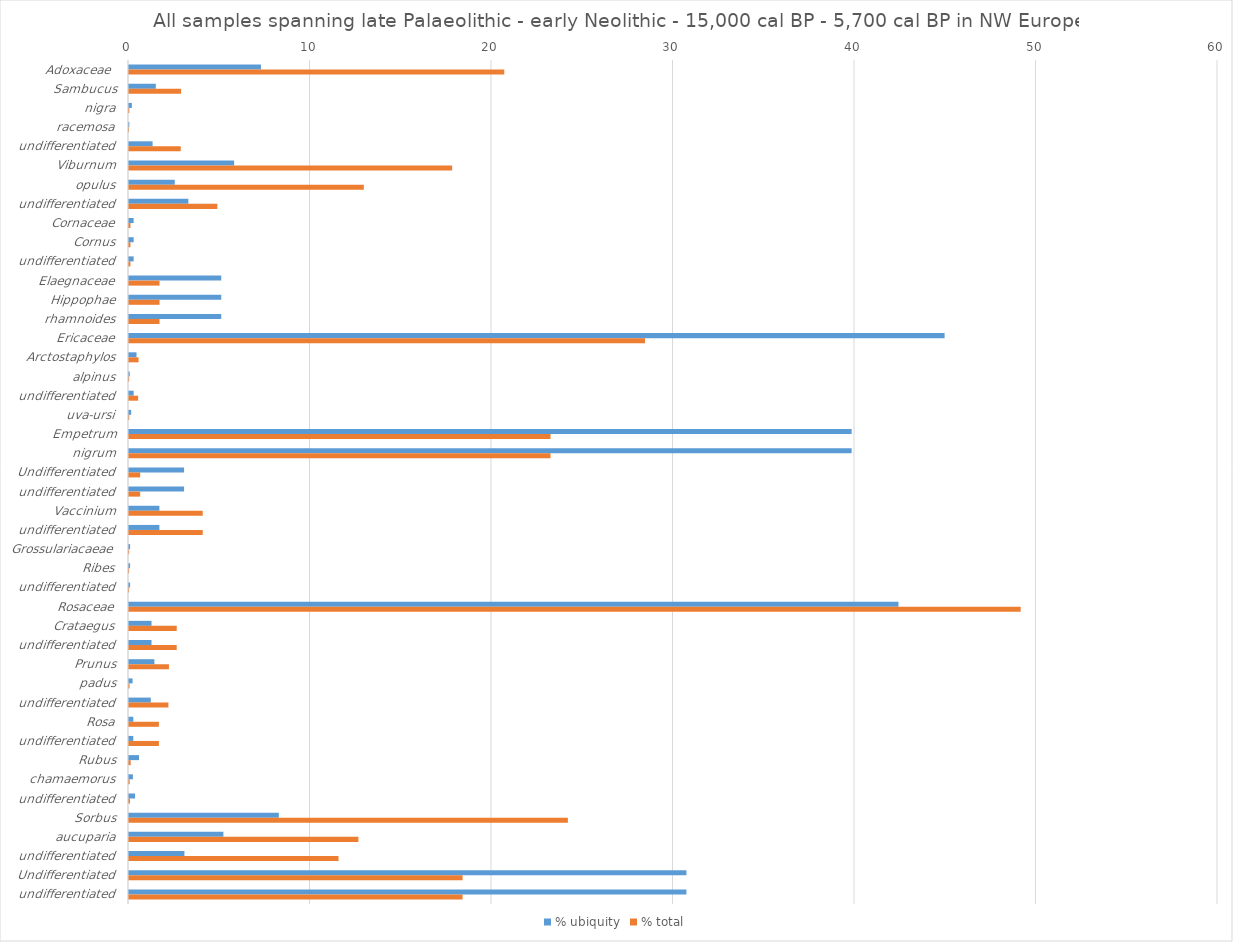
| Category | % ubiquity | % total |
|---|---|---|
| Adoxaceae  | 7.27 | 20.674 |
| Sambucus | 1.478 | 2.87 |
| nigra | 0.158 | 0.018 |
| racemosa | 0.02 | 0 |
| undifferentiated | 1.3 | 2.851 |
| Viburnum | 5.792 | 17.804 |
| opulus | 2.522 | 12.938 |
| undifferentiated | 3.27 | 4.866 |
| Cornaceae | 0.256 | 0.079 |
| Cornus | 0.256 | 0.079 |
| undifferentiated | 0.256 | 0.079 |
| Elaegnaceae | 5.083 | 1.683 |
| Hippophae | 5.083 | 1.683 |
| rhamnoides | 5.083 | 1.683 |
| Ericaceae | 44.937 | 28.431 |
| Arctostaphylos | 0.414 | 0.526 |
| alpinus | 0.039 | 0.009 |
| undifferentiated | 0.256 | 0.503 |
| uva-ursi | 0.118 | 0.014 |
| Empetrum | 39.815 | 23.225 |
| nigrum | 39.815 | 23.225 |
| Undifferentiated | 3.034 | 0.617 |
| undifferentiated | 3.034 | 0.617 |
| Vaccinium | 1.675 | 4.063 |
| undifferentiated | 1.675 | 4.063 |
| Grossulariacaeae | 0.059 | 0.004 |
| Ribes | 0.059 | 0.004 |
| undifferentiated | 0.059 | 0.004 |
| Rosaceae | 42.396 | 49.128 |
| Crataegus | 1.241 | 2.629 |
| undifferentiated | 1.241 | 2.629 |
| Prunus | 1.399 | 2.2 |
| padus | 0.197 | 0.03 |
| undifferentiated | 1.202 | 2.171 |
| Rosa | 0.236 | 1.647 |
| undifferentiated | 0.236 | 1.647 |
| Rubus | 0.552 | 0.092 |
| chamaemorus | 0.217 | 0.038 |
| undifferentiated | 0.335 | 0.054 |
| Sorbus | 8.255 | 24.181 |
| aucuparia | 5.201 | 12.639 |
| undifferentiated | 3.054 | 11.542 |
| Undifferentiated | 30.713 | 18.379 |
| undifferentiated | 30.713 | 18.379 |